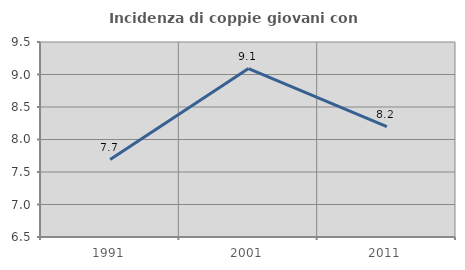
| Category | Incidenza di coppie giovani con figli |
|---|---|
| 1991.0 | 7.692 |
| 2001.0 | 9.091 |
| 2011.0 | 8.197 |